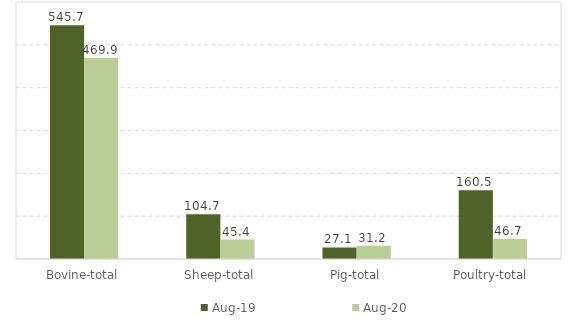
| Category | Aug-19 | Aug-20 |
|---|---|---|
| Bovine-total | 545.7 | 469.9 |
| Sheep-total | 104.7 | 45.4 |
| Pig-total | 27.1 | 31.2 |
| Poultry-total | 160.5 | 46.7 |